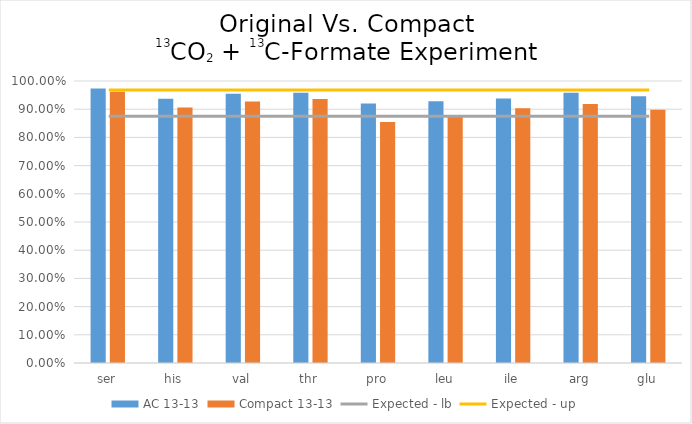
| Category | AC 13-13 | Compact 13-13 |
|---|---|---|
| ser | 0.973 | 0.962 |
| his | 0.937 | 0.906 |
| val | 0.955 | 0.928 |
| thr | 0.958 | 0.936 |
| pro | 0.92 | 0.854 |
| leu | 0.928 | 0.877 |
| ile | 0.938 | 0.903 |
| arg | 0.958 | 0.918 |
| glu | 0.946 | 0.898 |